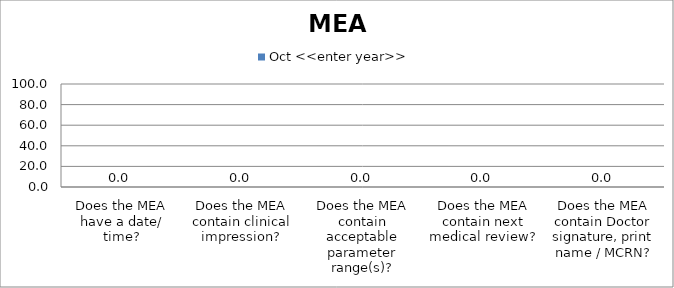
| Category | Oct <<enter year>> |
|---|---|
| Does the MEA have a date/ time? | 0 |
| Does the MEA contain clinical impression? | 0 |
| Does the MEA contain acceptable parameter range(s)? | 0 |
| Does the MEA contain next medical review? | 0 |
| Does the MEA contain Doctor signature, print name / MCRN? | 0 |